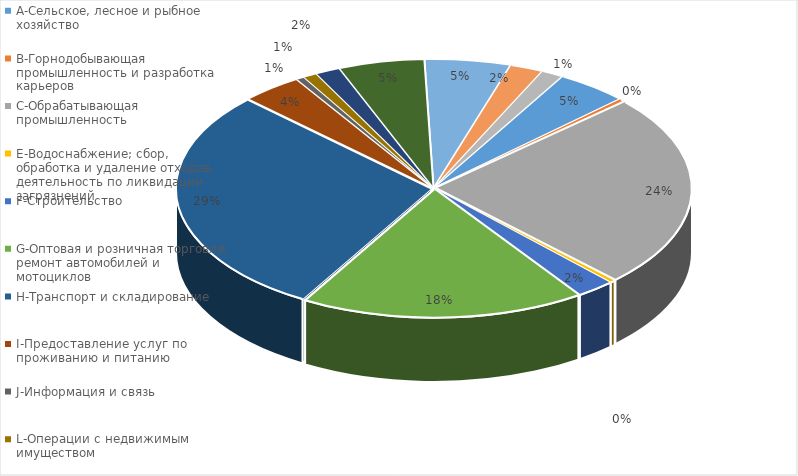
| Category |  Доля, %  |
|---|---|
| A-Сельское, лесное и рыбное хозяйство | 0.045 |
| B-Горнодобывающая промышленность и разработка карьеров | 0.003 |
| C-Обрабатывающая промышленность | 0.244 |
| E-Водоснабжение; сбор, обработка и удаление отходов, деятельность по ликвидации загрязнений | 0.003 |
| F-Строительство | 0.024 |
| G-Оптовая и розничная торговля; ремонт автомобилей и мотоциклов | 0.18 |
| H-Транспорт и складирование | 0.288 |
| I-Предоставление услуг по проживанию и питанию | 0.038 |
| J-Информация и связь | 0.005 |
| L-Операции с недвижимым имуществом | 0.009 |
| N-Деятельность в области административного и вспомогательного обслуживания | 0.016 |
| P-Образование | 0.054 |
| Q-Здравоохранение и социальное обслуживание населения | 0.054 |
| R-Искусство, развлечения и отдых | 0.021 |
| S-Предоставление прочих видов услуг | 0.014 |